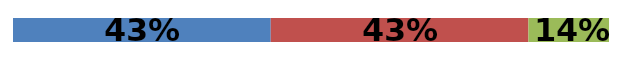
| Category | Series 0 | Series 1 | Series 2 |
|---|---|---|---|
| 0 | 0.432 | 0.432 | 0.135 |